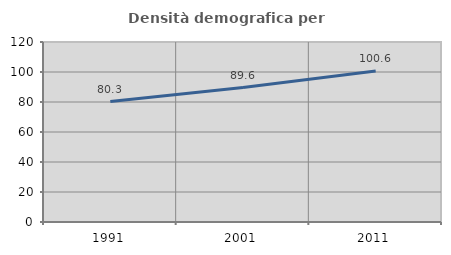
| Category | Densità demografica |
|---|---|
| 1991.0 | 80.289 |
| 2001.0 | 89.62 |
| 2011.0 | 100.635 |